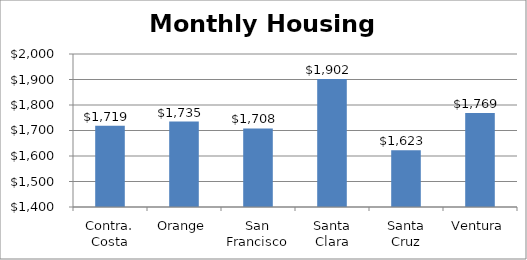
| Category | Series 0 |
|---|---|
| Contra. Costa | 1719 |
| Orange | 1735 |
| San Francisco | 1708 |
| Santa Clara | 1902 |
| Santa Cruz | 1623 |
| Ventura | 1769 |